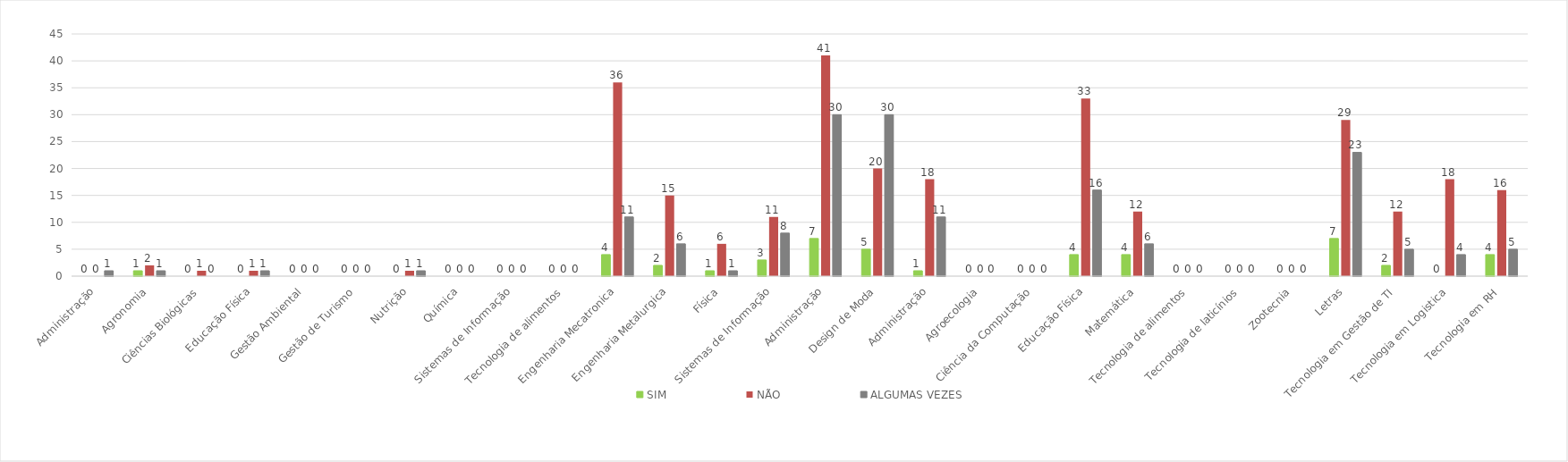
| Category | SIM | NÃO | ALGUMAS VEZES |
|---|---|---|---|
| Administração | 0 | 0 | 1 |
| Agronomia | 1 | 2 | 1 |
| Ciências Biológicas | 0 | 1 | 0 |
| Educação Física | 0 | 1 | 1 |
| Gestão Ambiental | 0 | 0 | 0 |
| Gestão de Turismo | 0 | 0 | 0 |
| Nutrição | 0 | 1 | 1 |
| Química | 0 | 0 | 0 |
| Sistemas de Informação | 0 | 0 | 0 |
| Tecnologia de alimentos | 0 | 0 | 0 |
| Engenharia Mecatronica | 4 | 36 | 11 |
| Engenharia Metalurgica | 2 | 15 | 6 |
| Física | 1 | 6 | 1 |
| Sistemas de Informação | 3 | 11 | 8 |
| Administração | 7 | 41 | 30 |
| Design de Moda | 5 | 20 | 30 |
| Administração | 1 | 18 | 11 |
| Agroecologia | 0 | 0 | 0 |
| Ciência da Computação | 0 | 0 | 0 |
| Educação Física | 4 | 33 | 16 |
| Matemática | 4 | 12 | 6 |
| Tecnologia de alimentos | 0 | 0 | 0 |
| Tecnologia de laticínios | 0 | 0 | 0 |
| Zootecnia | 0 | 0 | 0 |
| Letras | 7 | 29 | 23 |
| Tecnologia em Gestão de TI | 2 | 12 | 5 |
| Tecnologia em Logistica | 0 | 18 | 4 |
| Tecnologia em RH | 4 | 16 | 5 |